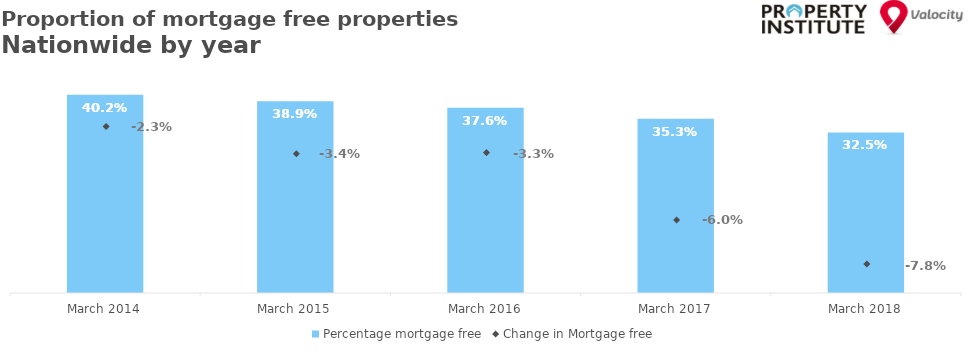
| Category | Percentage mortgage free |
|---|---|
| 2014-03-01 | 0.402 |
| 2015-03-01 | 0.389 |
| 2016-03-01 | 0.376 |
| 2017-03-01 | 0.353 |
| 2018-03-01 | 0.325 |